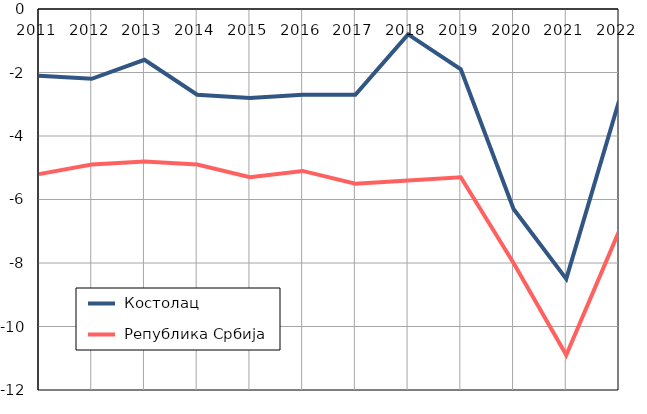
| Category |  Костолац |  Република Србија |
|---|---|---|
| 2011.0 | -2.1 | -5.2 |
| 2012.0 | -2.2 | -4.9 |
| 2013.0 | -1.6 | -4.8 |
| 2014.0 | -2.7 | -4.9 |
| 2015.0 | -2.8 | -5.3 |
| 2016.0 | -2.7 | -5.1 |
| 2017.0 | -2.7 | -5.5 |
| 2018.0 | -0.8 | -5.4 |
| 2019.0 | -1.9 | -5.3 |
| 2020.0 | -6.3 | -8 |
| 2021.0 | -8.5 | -10.9 |
| 2022.0 | -2.9 | -7 |